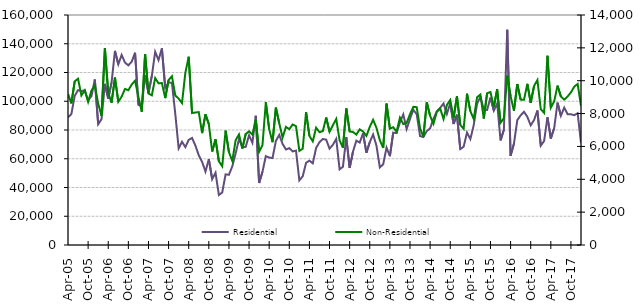
| Category | Residential |
|---|---|
| 2005-04-01 | 88840 |
| 2005-05-01 | 91030 |
| 2005-06-01 | 103700 |
| 2005-07-01 | 107770 |
| 2005-08-01 | 107040 |
| 2005-09-01 | 107710 |
| 2005-10-01 | 100650 |
| 2005-11-01 | 103570 |
| 2005-12-01 | 115150 |
| 2006-01-01 | 83980 |
| 2006-02-01 | 87550 |
| 2006-03-01 | 112090 |
| 2006-04-01 | 101830 |
| 2006-05-01 | 113160 |
| 2006-06-01 | 135030 |
| 2006-07-01 | 125720 |
| 2006-08-01 | 132180 |
| 2006-09-01 | 126890 |
| 2006-10-01 | 124980 |
| 2006-11-01 | 127530 |
| 2006-12-01 | 133770 |
| 2007-01-01 | 97580 |
| 2007-02-01 | 96560 |
| 2007-03-01 | 117970 |
| 2007-04-01 | 105780 |
| 2007-05-01 | 117560 |
| 2007-06-01 | 134370 |
| 2007-07-01 | 128660 |
| 2007-08-01 | 136790 |
| 2007-09-01 | 109250 |
| 2007-10-01 | 113080 |
| 2007-11-01 | 112770 |
| 2007-12-01 | 91140 |
| 2008-01-01 | 67220 |
| 2008-02-01 | 71820 |
| 2008-03-01 | 68100 |
| 2008-04-01 | 73130 |
| 2008-05-01 | 74470 |
| 2008-06-01 | 69150 |
| 2008-07-01 | 62400 |
| 2008-08-01 | 57810 |
| 2008-09-01 | 51080 |
| 2008-10-01 | 59710 |
| 2008-11-01 | 45780 |
| 2008-12-01 | 50260 |
| 2009-01-01 | 34750 |
| 2009-02-01 | 36580 |
| 2009-03-01 | 49130 |
| 2009-04-01 | 48840 |
| 2009-05-01 | 54720 |
| 2009-06-01 | 63710 |
| 2009-07-01 | 73760 |
| 2009-08-01 | 68080 |
| 2009-09-01 | 68260 |
| 2009-10-01 | 76320 |
| 2009-11-01 | 71150 |
| 2009-12-01 | 89920 |
| 2010-01-01 | 43110 |
| 2010-02-01 | 50920 |
| 2010-03-01 | 61810 |
| 2010-04-01 | 60830 |
| 2010-05-01 | 60500 |
| 2010-06-01 | 72370 |
| 2010-07-01 | 76590 |
| 2010-08-01 | 70320 |
| 2010-09-01 | 66440 |
| 2010-10-01 | 67380 |
| 2010-11-01 | 65080 |
| 2010-12-01 | 65650 |
| 2011-01-01 | 44970 |
| 2011-02-01 | 47830 |
| 2011-03-01 | 57200 |
| 2011-04-01 | 58700 |
| 2011-05-01 | 56820 |
| 2011-06-01 | 67500 |
| 2011-07-01 | 71550 |
| 2011-08-01 | 73720 |
| 2011-09-01 | 73310 |
| 2011-10-01 | 67030 |
| 2011-11-01 | 69730 |
| 2011-12-01 | 73780 |
| 2012-01-01 | 52630 |
| 2012-02-01 | 54440 |
| 2012-03-01 | 74960 |
| 2012-04-01 | 53590 |
| 2012-05-01 | 64960 |
| 2012-06-01 | 72590 |
| 2012-07-01 | 71240 |
| 2012-08-01 | 77690 |
| 2012-09-01 | 64200 |
| 2012-10-01 | 71490 |
| 2012-11-01 | 76910 |
| 2012-12-01 | 69100 |
| 2013-01-01 | 53990 |
| 2013-02-01 | 56120 |
| 2013-03-01 | 67740 |
| 2013-04-01 | 61780 |
| 2013-05-01 | 78170 |
| 2013-06-01 | 77850 |
| 2013-07-01 | 85310 |
| 2013-08-01 | 90850 |
| 2013-09-01 | 80640 |
| 2013-10-01 | 87730 |
| 2013-11-01 | 94020 |
| 2013-12-01 | 91030 |
| 2014-01-01 | 75750 |
| 2014-02-01 | 75100 |
| 2014-03-01 | 79280 |
| 2014-04-01 | 81140 |
| 2014-05-01 | 87930 |
| 2014-06-01 | 92950 |
| 2014-07-01 | 95430 |
| 2014-08-01 | 98450 |
| 2014-09-01 | 91170 |
| 2014-10-01 | 98630 |
| 2014-11-01 | 84150 |
| 2014-12-01 | 90650 |
| 2015-01-01 | 66750 |
| 2015-02-01 | 68390 |
| 2015-03-01 | 78240 |
| 2015-04-01 | 73690 |
| 2015-05-01 | 83310 |
| 2015-06-01 | 98200 |
| 2015-07-01 | 103160 |
| 2015-08-01 | 94260 |
| 2015-09-01 | 93940 |
| 2015-10-01 | 102540 |
| 2015-11-01 | 93490 |
| 2015-12-01 | 98400 |
| 2016-01-01 | 72750 |
| 2016-02-01 | 80110 |
| 2016-03-01 | 149710 |
| 2016-04-01 | 62150 |
| 2016-05-01 | 70480 |
| 2016-06-01 | 86840 |
| 2016-07-01 | 90220 |
| 2016-08-01 | 92660 |
| 2016-09-01 | 89130 |
| 2016-10-01 | 83270 |
| 2016-11-01 | 86930 |
| 2016-12-01 | 93570 |
| 2017-01-01 | 69120 |
| 2017-02-01 | 72400 |
| 2017-03-01 | 88860 |
| 2017-04-01 | 74070 |
| 2017-05-01 | 81310 |
| 2017-06-01 | 99040 |
| 2017-07-01 | 89900 |
| 2017-08-01 | 95590 |
| 2017-09-01 | 90980 |
| 2017-10-01 | 90950 |
| 2017-11-01 | 90310 |
| 2017-12-01 | 91670 |
| 2018-01-01 | 70930 |